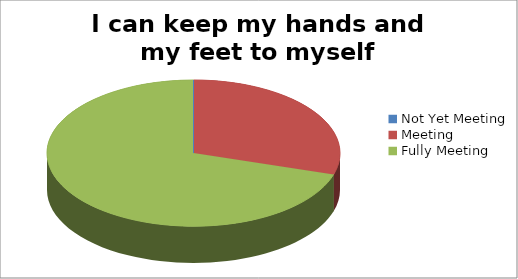
| Category | I can keep my hands and my feet to myself |
|---|---|
| Not Yet Meeting | 0 |
| Meeting | 11 |
| Fully Meeting | 26 |